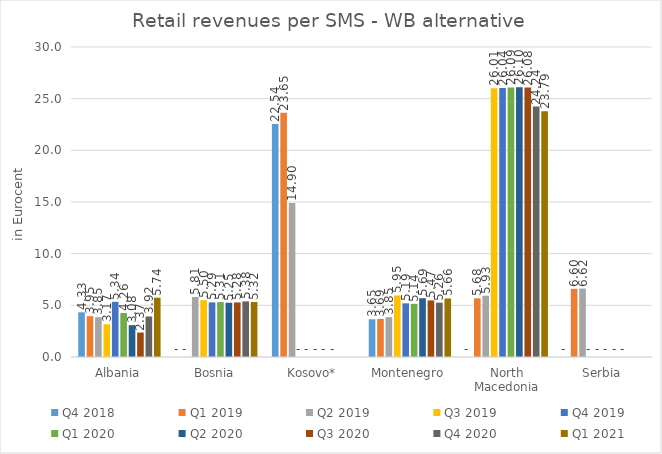
| Category | Q4 2018 | Q1 2019 | Q2 2019 | Q3 2019 | Q4 2019 | Q1 2020 | Q2 2020 | Q3 2020 | Q4 2020 | Q1 2021 |
|---|---|---|---|---|---|---|---|---|---|---|
| Albania | 4.326 | 3.949 | 3.849 | 3.169 | 5.337 | 4.265 | 3.084 | 2.366 | 3.922 | 5.739 |
| Bosnia | 0 | 0 | 5.805 | 5.499 | 5.286 | 5.313 | 5.252 | 5.281 | 5.382 | 5.32 |
| Kosovo* | 22.539 | 23.647 | 14.902 | 0 | 0 | 0 | 0 | 0 | 0 | 0 |
| Montenegro | 3.647 | 3.691 | 3.852 | 5.952 | 5.193 | 5.143 | 5.687 | 5.473 | 5.26 | 5.665 |
| North Macedonia | 0 | 5.677 | 5.93 | 26.006 | 26.035 | 26.086 | 26.095 | 26.077 | 24.236 | 23.793 |
| Serbia | 0 | 6.596 | 6.622 | 0 | 0 | 0 | 0 | 0 | 0 | 0 |